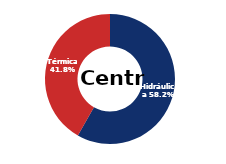
| Category | Centro |
|---|---|
| Eólica | 0 |
| Hidráulica | 1852.251 |
| Solar | 0.006 |
| Térmica | 1328.732 |